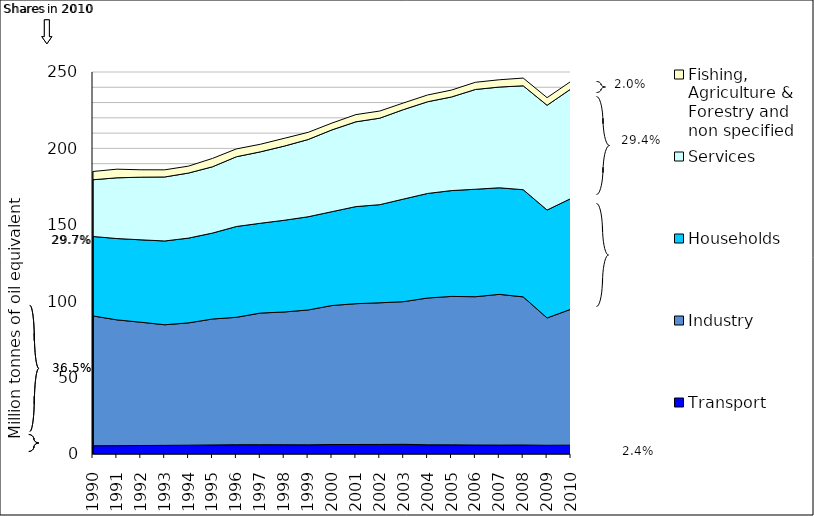
| Category | Transport | Industry | Households | Services | Fishing, Agriculture & Forestry and non specified |
|---|---|---|---|---|---|
| 1990 | 5.414 | 84.927 | 52.022 | 37.122 | 5.41 |
| 1991 | 5.477 | 82.311 | 53.225 | 39.739 | 5.649 |
| 1992 | 5.545 | 80.708 | 53.915 | 41.001 | 4.831 |
| 1993 | 5.65 | 78.924 | 54.839 | 41.88 | 4.677 |
| 1994 | 5.77 | 80.054 | 55.469 | 42.582 | 4.54 |
| 1995 | 5.922 | 82.423 | 56.239 | 43.393 | 5.466 |
| 1996 | 6.071 | 83.393 | 59.416 | 45.663 | 5.119 |
| 1997 | 6.089 | 86.128 | 58.784 | 46.728 | 4.973 |
| 1998 | 6.058 | 86.891 | 60.011 | 48.539 | 5.086 |
| 1999 | 6 | 88.26 | 60.993 | 50.56 | 4.678 |
| 2000 | 6.202 | 90.972 | 61.42 | 53.539 | 4.457 |
| 2001 | 6.223 | 92.155 | 63.537 | 55.482 | 4.727 |
| 2002 | 6.255 | 92.705 | 64.216 | 56.609 | 4.675 |
| 2003 | 6.335 | 93.37 | 67.167 | 58.569 | 4.347 |
| 2004 | 6.012 | 96.073 | 68.428 | 60.017 | 4.421 |
| 2005 | 5.993 | 97.143 | 69.26 | 61.272 | 4.511 |
| 2006 | 5.875 | 97.054 | 70.343 | 65.292 | 4.703 |
| 2007 | 5.835 | 98.644 | 69.743 | 65.929 | 4.762 |
| 2008 | 5.891 | 96.948 | 70.134 | 67.997 | 5.069 |
| 2009 | 5.712 | 83.323 | 70.636 | 68.554 | 4.977 |
| 2010 | 5.807 | 88.964 | 72.456 | 71.721 | 4.96 |